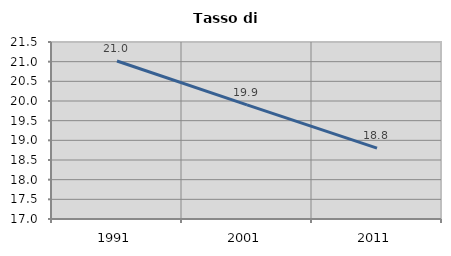
| Category | Tasso di disoccupazione   |
|---|---|
| 1991.0 | 21.016 |
| 2001.0 | 19.903 |
| 2011.0 | 18.803 |